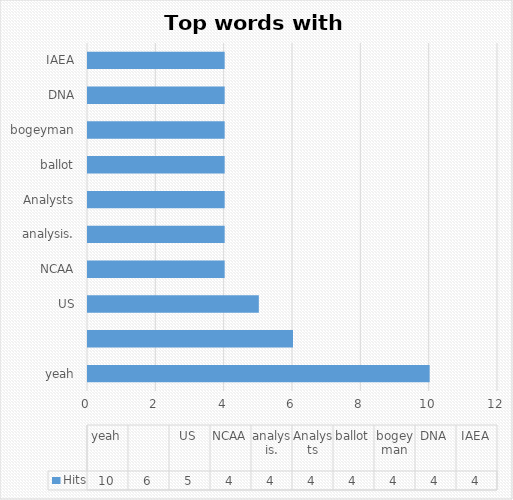
| Category | Hits |
|---|---|
| yeah, | 10 |
| US | 6 |
| NCAA | 5 |
| analysis. | 4 |
| Analysts | 4 |
| ballot | 4 |
| bogeyman | 4 |
| DNA | 4 |
| IAEA | 4 |
| LIU-Brooklyn | 4 |